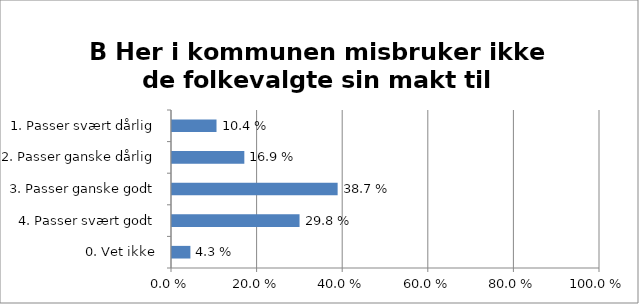
| Category |  
B Her i kommunen misbruker ikke de folkevalgte sin makt til personlig fordel  |
|---|---|
| 1. Passer svært dårlig | 0.104 |
| 2. Passer ganske dårlig | 0.169 |
| 3. Passer ganske godt | 0.387 |
| 4. Passer svært godt | 0.298 |
| 0. Vet ikke | 0.043 |